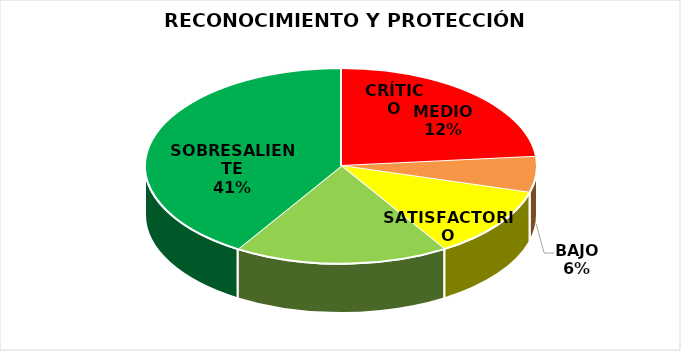
| Category | Series 0 |
|---|---|
| CRÍTICO | 4 |
| BAJO | 1 |
| MEDIO | 2 |
| SATISFACTORIO | 3 |
| SOBRESALIENTE | 7 |